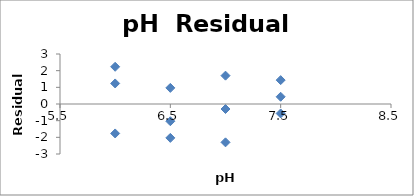
| Category | Series 0 |
|---|---|
| 6.0 | -1.767 |
| 6.0 | 1.233 |
| 6.0 | 2.233 |
| 6.5 | -2.033 |
| 6.5 | -1.033 |
| 6.5 | 0.967 |
| 7.0 | -2.3 |
| 7.0 | -0.3 |
| 7.0 | 1.7 |
| 7.5 | -0.567 |
| 7.5 | 0.433 |
| 7.5 | 1.433 |